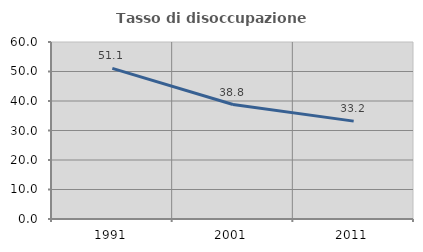
| Category | Tasso di disoccupazione giovanile  |
|---|---|
| 1991.0 | 51.064 |
| 2001.0 | 38.8 |
| 2011.0 | 33.178 |